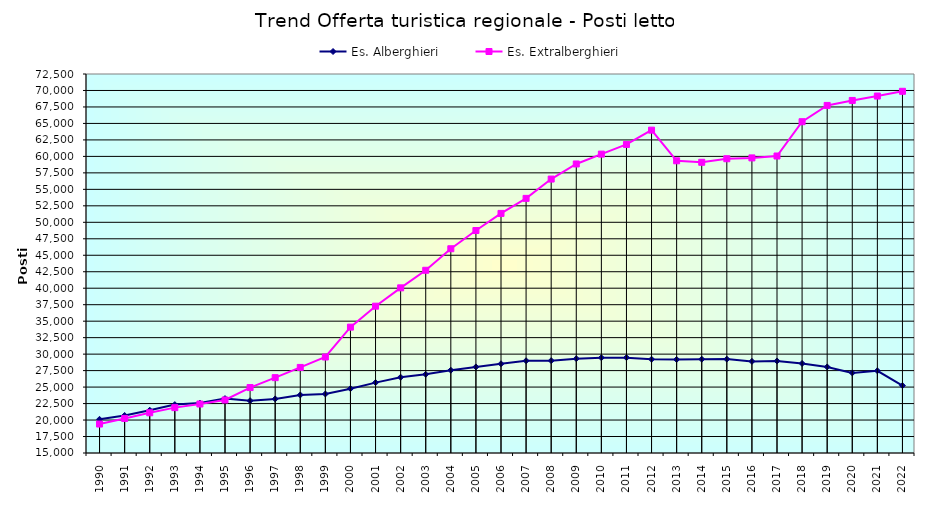
| Category | Es. Alberghieri | Es. Extralberghieri |
|---|---|---|
| 1990.0 | 20111 | 19393 |
| 1991.0 | 20696 | 20248 |
| 1992.0 | 21489 | 21101 |
| 1993.0 | 22343 | 21883 |
| 1994.0 | 22574 | 22433 |
| 1995.0 | 23255 | 23039 |
| 1996.0 | 22936 | 24928 |
| 1997.0 | 23205 | 26431 |
| 1998.0 | 23803 | 27982 |
| 1999.0 | 23958 | 29562 |
| 2000.0 | 24762 | 34095 |
| 2001.0 | 25679 | 37274 |
| 2002.0 | 26493 | 40055 |
| 2003.0 | 26935 | 42722 |
| 2004.0 | 27555 | 45990 |
| 2005.0 | 28057 | 48755 |
| 2006.0 | 28538 | 51348 |
| 2007.0 | 28995 | 53630 |
| 2008.0 | 29012 | 56559 |
| 2009.0 | 29313 | 58849 |
| 2010.0 | 29455 | 60345 |
| 2011.0 | 29468 | 61812 |
| 2012.0 | 29226 | 63981 |
| 2013.0 | 29190 | 59333 |
| 2014.0 | 29232 | 59105 |
| 2015.0 | 29244 | 59643 |
| 2016.0 | 28899 | 59770 |
| 2017.0 | 28964 | 60058 |
| 2018.0 | 28582 | 65265 |
| 2019.0 | 28058 | 67733 |
| 2020.0 | 27152 | 68489 |
| 2021.0 | 27470 | 69153 |
| 2022.0 | 25223 | 69874 |